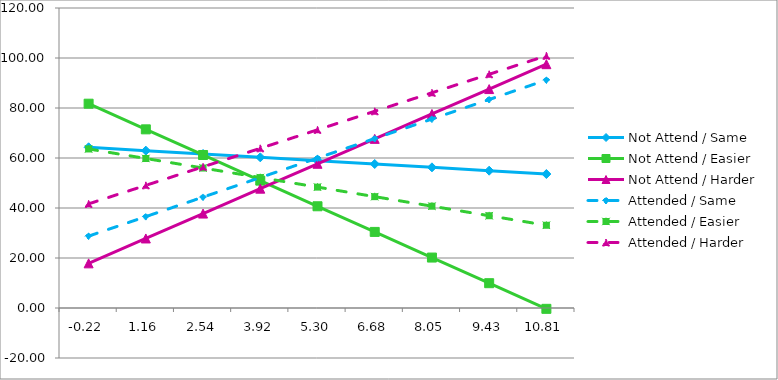
| Category | Not Attend / Same | Not Attend / Easier | Not Attend / Harder | Attended / Same | Attended / Easier | Attended / Harder |
|---|---|---|---|---|---|---|
| -0.21999999999999975 | 64.283 | 81.719 | 17.856 | 28.756 | 63.618 | 41.659 |
| 1.1589999999999998 | 62.947 | 71.462 | 27.816 | 36.562 | 59.802 | 49.064 |
| 2.5380000000000003 | 61.611 | 61.205 | 37.775 | 44.367 | 55.986 | 56.47 |
| 3.9170000000000003 | 60.274 | 50.948 | 47.734 | 52.172 | 52.171 | 63.875 |
| 5.296 | 58.938 | 40.691 | 57.693 | 59.977 | 48.355 | 71.28 |
| 6.675000000000001 | 57.602 | 30.434 | 67.652 | 67.782 | 44.539 | 78.685 |
| 8.054 | 56.265 | 20.177 | 77.611 | 75.587 | 40.724 | 86.09 |
| 9.433 | 54.929 | 9.92 | 87.57 | 83.392 | 36.908 | 93.496 |
| 10.812000000000001 | 53.593 | -0.337 | 97.53 | 91.198 | 33.092 | 100.901 |